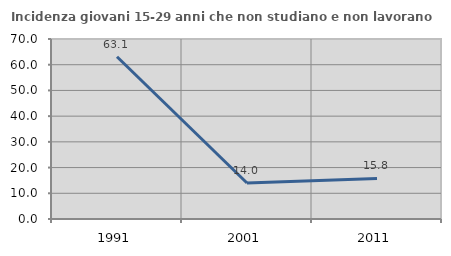
| Category | Incidenza giovani 15-29 anni che non studiano e non lavorano  |
|---|---|
| 1991.0 | 63.083 |
| 2001.0 | 14 |
| 2011.0 | 15.789 |